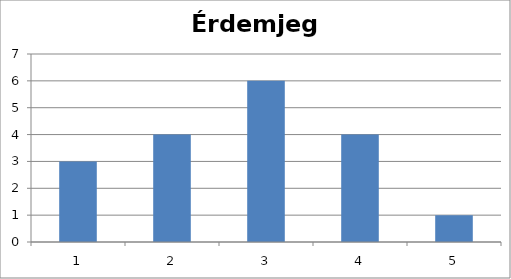
| Category | Érdemjegy |
|---|---|
| 1.0 | 3 |
| 2.0 | 4 |
| 3.0 | 6 |
| 4.0 | 4 |
| 5.0 | 1 |